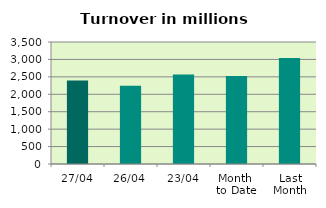
| Category | Series 0 |
|---|---|
| 27/04 | 2395.382 |
| 26/04 | 2241.829 |
| 23/04 | 2565.314 |
| Month 
to Date | 2522.961 |
| Last
Month | 3040.277 |